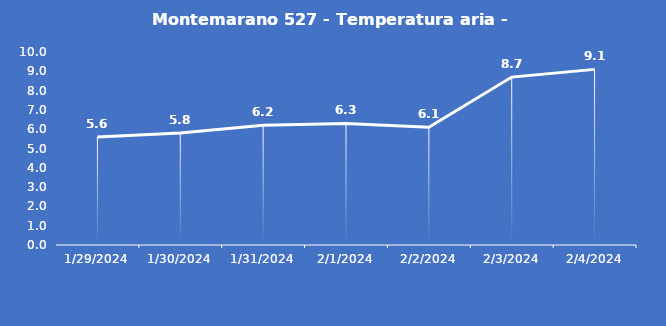
| Category | Montemarano 527 - Temperatura aria - Grezzo (°C) |
|---|---|
| 1/29/24 | 5.6 |
| 1/30/24 | 5.8 |
| 1/31/24 | 6.2 |
| 2/1/24 | 6.3 |
| 2/2/24 | 6.1 |
| 2/3/24 | 8.7 |
| 2/4/24 | 9.1 |